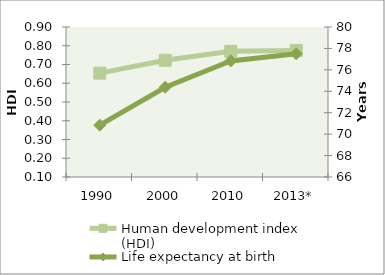
| Category | Human development index (HDI) |
|---|---|
| 1990 | 0.654 |
| 2000 | 0.723 |
| 2010 | 0.77 |
| 2013* | 0.775 |